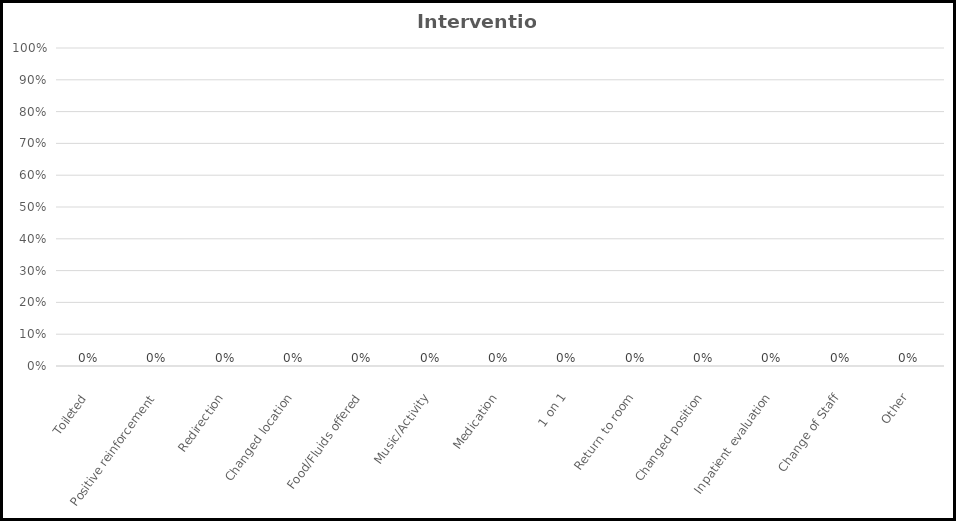
| Category | Intervention |
|---|---|
| Toileted | 0 |
| Positive reinforcement | 0 |
| Redirection | 0 |
| Changed location | 0 |
| Food/Fluids offered | 0 |
| Music/Activity | 0 |
| Medication | 0 |
| 1 on 1 | 0 |
| Return to room | 0 |
| Changed position | 0 |
| Inpatient evaluation | 0 |
| Change of Staff | 0 |
| Other | 0 |